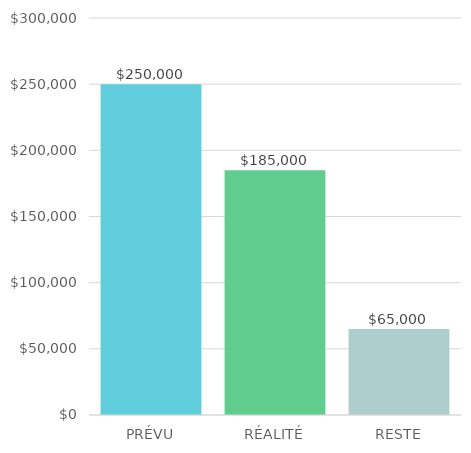
| Category | Series 0 |
|---|---|
| PRÉVU | 250000 |
| RÉALITÉ | 185000 |
| RESTE | 65000 |